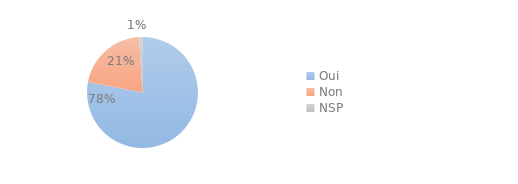
| Category | Series 0 |
|---|---|
| Oui | 0.78 |
| Non | 0.21 |
| NSP | 0.01 |